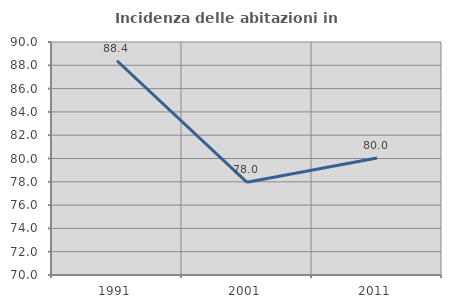
| Category | Incidenza delle abitazioni in proprietà  |
|---|---|
| 1991.0 | 88.391 |
| 2001.0 | 77.958 |
| 2011.0 | 80.042 |